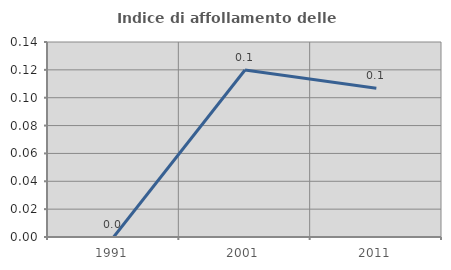
| Category | Indice di affollamento delle abitazioni  |
|---|---|
| 1991.0 | 0 |
| 2001.0 | 0.12 |
| 2011.0 | 0.107 |